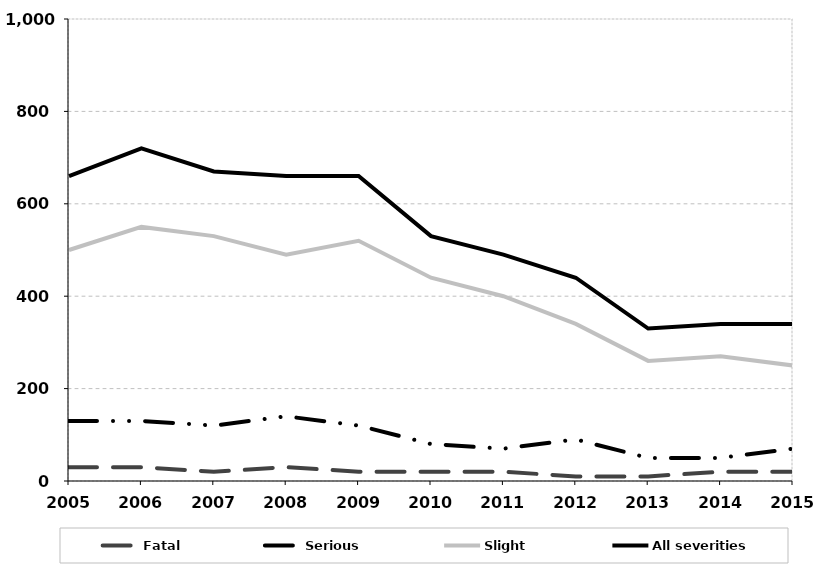
| Category | Fatal | Serious | Slight | All severities |
|---|---|---|---|---|
| 2005.0 | 30 | 130 | 500 | 660 |
| 2006.0 | 30 | 130 | 550 | 720 |
| 2007.0 | 20 | 120 | 530 | 670 |
| 2008.0 | 30 | 140 | 490 | 660 |
| 2009.0 | 20 | 120 | 520 | 660 |
| 2010.0 | 20 | 80 | 440 | 530 |
| 2011.0 | 20 | 70 | 400 | 490 |
| 2012.0 | 10 | 90 | 340 | 440 |
| 2013.0 | 10 | 50 | 260 | 330 |
| 2014.0 | 20 | 50 | 270 | 340 |
| 2015.0 | 20 | 70 | 250 | 340 |